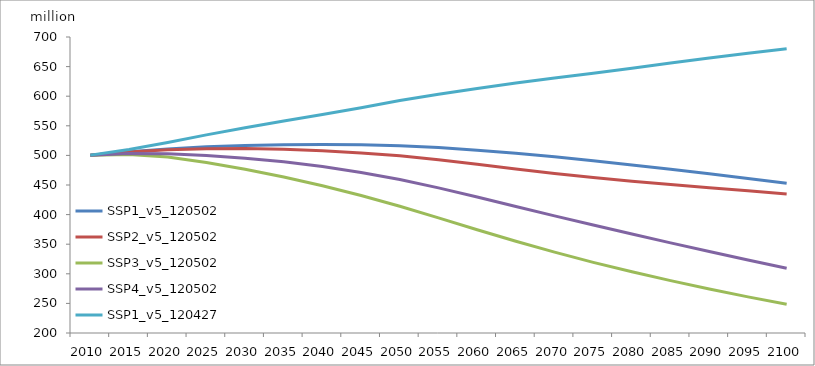
| Category | SSP1_v5_120502 | SSP2_v5_120502 | SSP3_v5_120502 | SSP4_v5_120502 | SSP1_v5_120427 |
|---|---|---|---|---|---|
| 2010.0 | 500.441 | 500.441 | 500.441 | 500.441 | 500.441 |
| 2015.0 | 506.2 | 505.897 | 501.599 | 503.3 | 510.131 |
| 2020.0 | 510.861 | 509.484 | 497.155 | 502.857 | 521.691 |
| 2025.0 | 514.442 | 511.396 | 488.024 | 499.862 | 534.662 |
| 2030.0 | 516.902 | 511.691 | 476.749 | 495.337 | 546.85 |
| 2035.0 | 518.135 | 510.319 | 463.601 | 489.085 | 558.124 |
| 2040.0 | 518.427 | 507.663 | 448.787 | 481.111 | 569.123 |
| 2045.0 | 517.91 | 503.995 | 432.257 | 471.243 | 580.586 |
| 2050.0 | 516.459 | 499.233 | 414.004 | 459.339 | 592.591 |
| 2055.0 | 513.232 | 492.775 | 394.43 | 445.152 | 603.378 |
| 2060.0 | 508.768 | 485.163 | 374.437 | 429.609 | 613.087 |
| 2065.0 | 503.606 | 477.214 | 354.946 | 413.646 | 622.164 |
| 2070.0 | 497.542 | 469.607 | 336.53 | 397.825 | 630.583 |
| 2075.0 | 490.815 | 462.704 | 319.357 | 382.333 | 638.841 |
| 2080.0 | 483.817 | 456.529 | 303.364 | 367.157 | 647.395 |
| 2085.0 | 476.473 | 450.903 | 288.42 | 352.281 | 656.153 |
| 2090.0 | 468.857 | 445.52 | 274.322 | 337.658 | 664.585 |
| 2095.0 | 460.854 | 440.16 | 260.989 | 323.294 | 672.415 |
| 2100.0 | 452.767 | 434.799 | 248.444 | 309.32 | 680.111 |